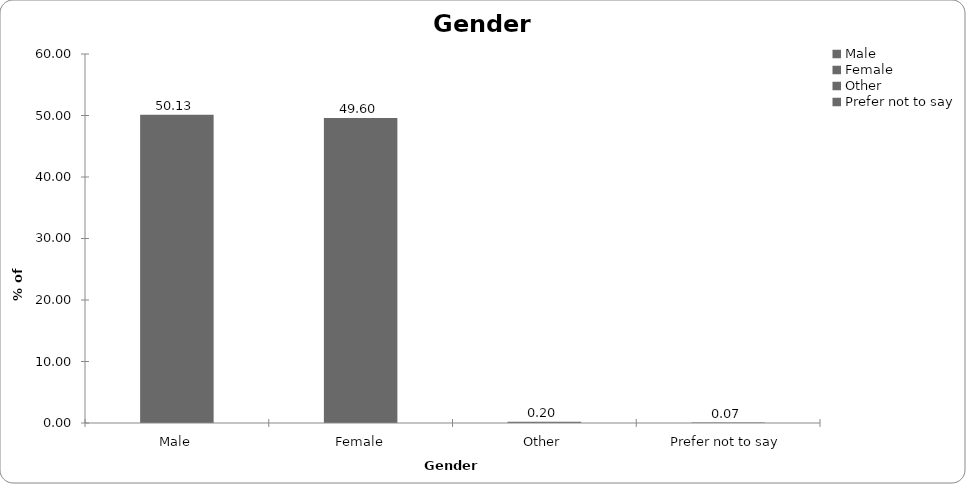
| Category | Series 0 |
|---|---|
| Male | 50.134 |
| Female | 49.599 |
| Other | 0.2 |
| Prefer not to say | 0.067 |